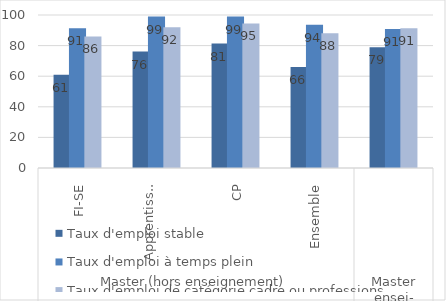
| Category | Taux d'emploi stable | Taux d'emploi à temps plein | Taux d'emploi de catégorie cadre ou professions intermédiaires |
|---|---|---|---|
| 0 | 60.99 | 91.38 | 85.98 |
| 1 | 76.1 | 98.95 | 92.03 |
| 2 | 81.36 | 98.98 | 94.52 |
| 3 | 66.09 | 93.65 | 88.02 |
| 4 | 78.85 | 90.89 | 91.31 |